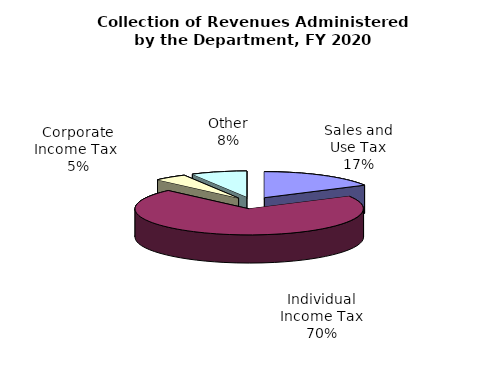
| Category | Series 0 |
|---|---|
| Sales and Use Tax | 3706817000 |
| Individual Income Tax | 15351592000 |
| Corporate Income Tax  | 1011650000 |
| Other | 1722032000 |